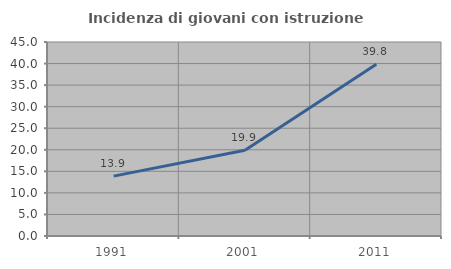
| Category | Incidenza di giovani con istruzione universitaria |
|---|---|
| 1991.0 | 13.889 |
| 2001.0 | 19.899 |
| 2011.0 | 39.85 |